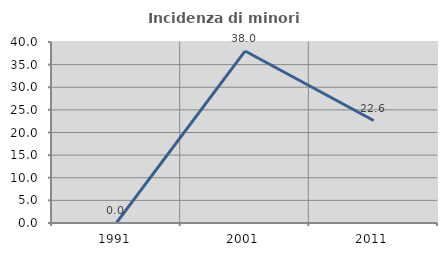
| Category | Incidenza di minori stranieri |
|---|---|
| 1991.0 | 0 |
| 2001.0 | 38 |
| 2011.0 | 22.642 |